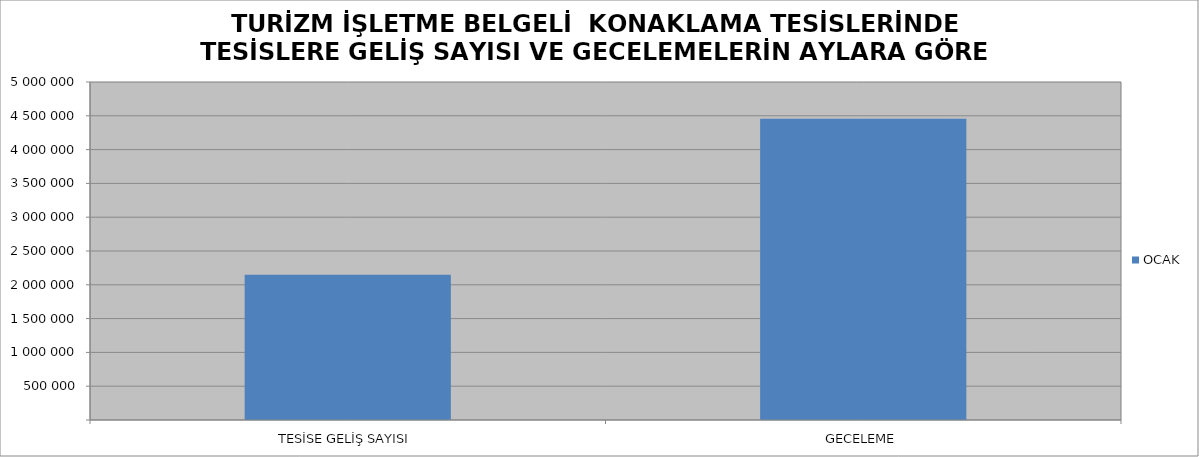
| Category | OCAK |
|---|---|
| TESİSE GELİŞ SAYISI | 2146994 |
| GECELEME | 4457352 |